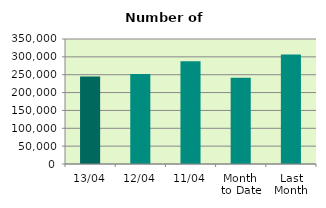
| Category | Series 0 |
|---|---|
| 13/04 | 244916 |
| 12/04 | 251970 |
| 11/04 | 287430 |
| Month 
to Date | 241206.333 |
| Last
Month | 306734.174 |